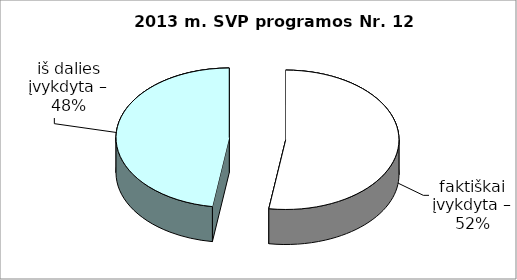
| Category | Series 0 |
|---|---|
| faktiškai įvykdyta – | 11 |
| iš dalies įvykdyta – | 10 |